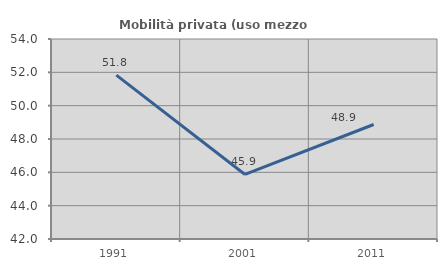
| Category | Mobilità privata (uso mezzo privato) |
|---|---|
| 1991.0 | 51.829 |
| 2001.0 | 45.872 |
| 2011.0 | 48.869 |